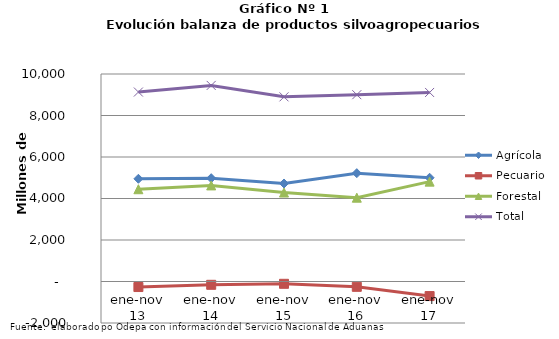
| Category | Agrícola | Pecuario | Forestal | Total |
|---|---|---|---|---|
| ene-nov 13 | 4950057 | -266672 | 4446897 | 9130282 |
| ene-nov 14 | 4978654 | -159452 | 4630506 | 9449708 |
| ene-nov 15 | 4723436 | -111336 | 4286694 | 8898794 |
| ene-nov 16 | 5220801 | -257189 | 4039108 | 9002720 |
| ene-nov 17 | 4999888 | -702394 | 4813197 | 9110691 |